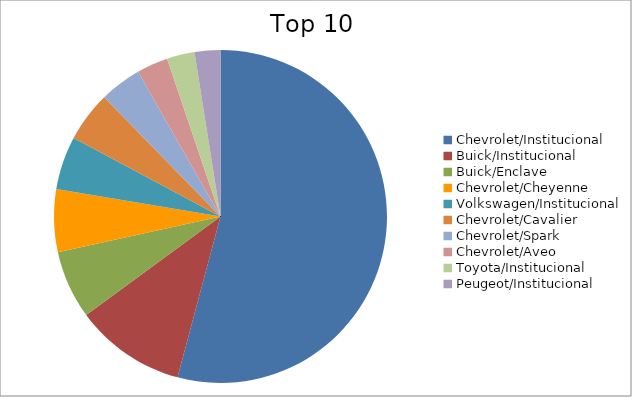
| Category | Series 0 |
|---|---|
| Chevrolet/Institucional | 47.42 |
| Buick/Institucional | 9.43 |
| Buick/Enclave | 5.81 |
| Chevrolet/Cheyenne | 5.32 |
| Volkswagen/Institucional | 4.52 |
| Chevrolet/Cavalier | 4.29 |
| Chevrolet/Spark | 3.55 |
| Chevrolet/Aveo | 2.67 |
| Toyota/Institucional | 2.36 |
| Peugeot/Institucional | 2.19 |